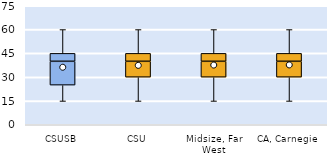
| Category | 25th | 50th | 75th |
|---|---|---|---|
| CSUSB | 25 | 15 | 5 |
| CSU | 30 | 10 | 5 |
| Midsize, Far West | 30 | 10 | 5 |
| CA, Carnegie | 30 | 10 | 5 |